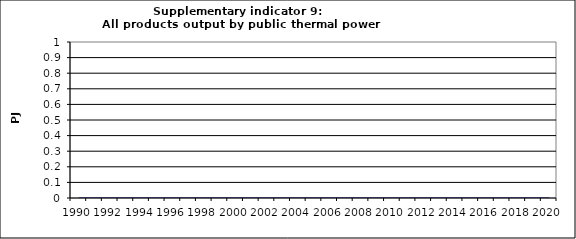
| Category | All products output by public thermal power stations, PJ |
|---|---|
| 1990 | 0 |
| 1991 | 0 |
| 1992 | 0 |
| 1993 | 0 |
| 1994 | 0 |
| 1995 | 0 |
| 1996 | 0 |
| 1997 | 0 |
| 1998 | 0 |
| 1999 | 0 |
| 2000 | 0 |
| 2001 | 0 |
| 2002 | 0 |
| 2003 | 0 |
| 2004 | 0 |
| 2005 | 0 |
| 2006 | 0 |
| 2007 | 0 |
| 2008 | 0 |
| 2009 | 0 |
| 2010 | 0 |
| 2011 | 0 |
| 2012 | 0 |
| 2013 | 0 |
| 2014 | 0 |
| 2015 | 0 |
| 2016 | 0 |
| 2017 | 0 |
| 2018 | 0 |
| 2019 | 0 |
| 2020 | 0 |